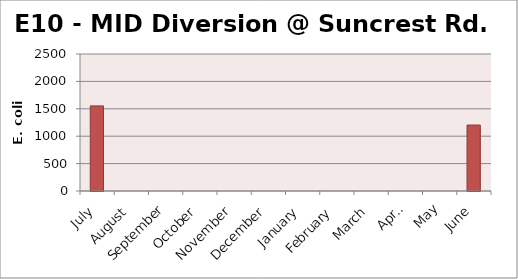
| Category | E. coli MPN |
|---|---|
| July | 1553.1 |
| August | 0 |
| September | 0 |
| October | 0 |
| November | 0 |
| December | 0 |
| January | 0 |
| February | 0 |
| March | 0 |
| April | 0 |
| May | 0 |
| June | 1203.3 |